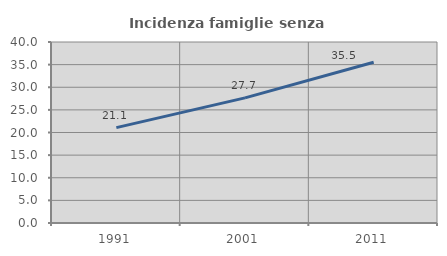
| Category | Incidenza famiglie senza nuclei |
|---|---|
| 1991.0 | 21.077 |
| 2001.0 | 27.65 |
| 2011.0 | 35.532 |